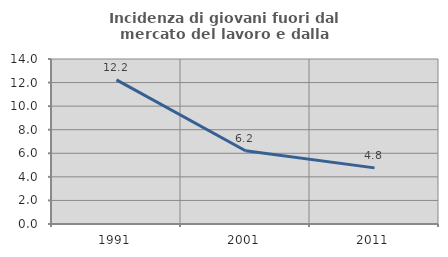
| Category | Incidenza di giovani fuori dal mercato del lavoro e dalla formazione  |
|---|---|
| 1991.0 | 12.23 |
| 2001.0 | 6.215 |
| 2011.0 | 4.762 |